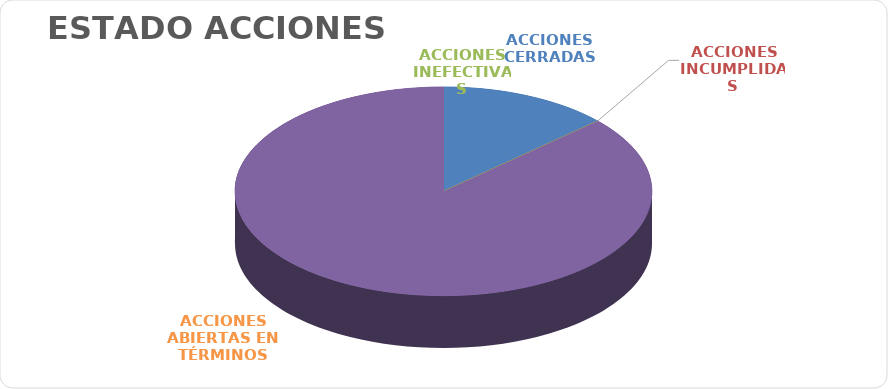
| Category | Series 0 |
|---|---|
| ACCIONES CERRADAS | 18 |
| ACCIONES INCUMPLIDAS | 0 |
| ACCIONES INEFECTIVAS | 0 |
| ACCIONES ABIERTAS EN TÉRMINOS | 118 |